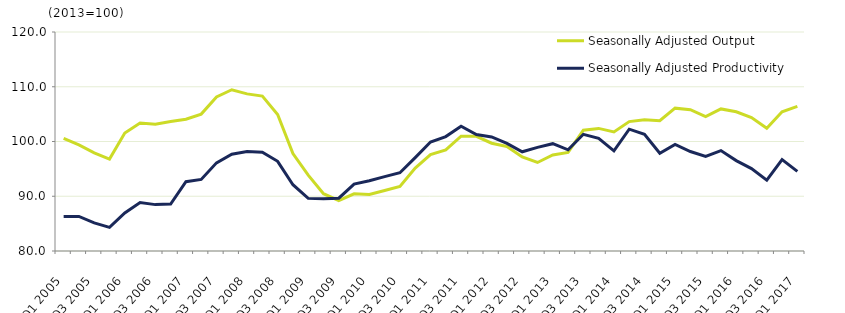
| Category | Seasonally Adjusted Output | Seasonally Adjusted Productivity |
|---|---|---|
| Q1 2005 | 100.583 | 86.303 |
| Q2 2005 | 99.378 | 86.319 |
| Q3 2005 | 97.933 | 85.136 |
| Q4 2005 | 96.788 | 84.316 |
| Q1 2006 | 101.562 | 86.936 |
| Q2 2006 | 103.377 | 88.837 |
| Q3 2006 | 103.147 | 88.472 |
| Q4 2006 | 103.665 | 88.572 |
| Q1 2007 | 104.07 | 92.663 |
| Q2 2007 | 105.003 | 93.076 |
| Q3 2007 | 108.131 | 96.106 |
| Q4 2007 | 109.452 | 97.673 |
| Q1 2008 | 108.699 | 98.162 |
| Q2 2008 | 108.296 | 98.041 |
| Q3 2008 | 104.934 | 96.379 |
| Q4 2008 | 97.798 | 92.11 |
| Q1 2009 | 93.867 | 89.609 |
| Q2 2009 | 90.472 | 89.526 |
| Q3 2009 | 89.208 | 89.648 |
| Q4 2009 | 90.454 | 92.228 |
| Q1 2010 | 90.314 | 92.845 |
| Q2 2010 | 91.042 | 93.585 |
| Q3 2010 | 91.777 | 94.289 |
| Q4 2010 | 95.145 | 97.054 |
| Q1 2011 | 97.618 | 99.915 |
| Q2 2011 | 98.465 | 100.894 |
| Q3 2011 | 100.965 | 102.779 |
| Q4 2011 | 100.95 | 101.261 |
| Q1 2012 | 99.683 | 100.836 |
| Q2 2012 | 99.088 | 99.661 |
| Q3 2012 | 97.193 | 98.12 |
| Q4 2012 | 96.166 | 98.927 |
| Q1 2013 | 97.53 | 99.602 |
| Q2 2013 | 98.011 | 98.478 |
| Q3 2013 | 102.067 | 101.315 |
| Q4 2013 | 102.392 | 100.57 |
| Q1 2014 | 101.755 | 98.303 |
| Q2 2014 | 103.638 | 102.248 |
| Q3 2014 | 103.98 | 101.298 |
| Q4 2014 | 103.806 | 97.861 |
| Q1 2015 | 106.093 | 99.479 |
| Q2 2015 | 105.812 | 98.17 |
| Q3 2015 | 104.547 | 97.295 |
| Q4 2015 | 105.947 | 98.336 |
| Q1 2016 | 105.433 | 96.514 |
| Q2 2016 | 104.383 | 95.048 |
| Q3 2016 | 102.422 | 92.931 |
| Q4 2016 | 105.435 | 96.709 |
| Q1 2017 | 106.421 | 94.545 |